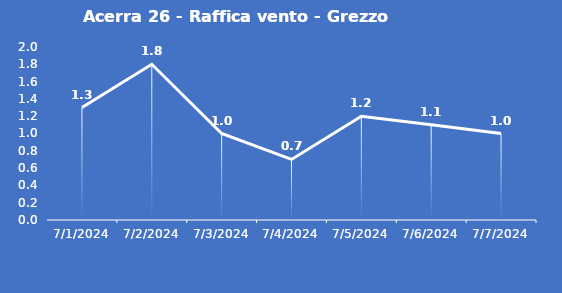
| Category | Acerra 26 - Raffica vento - Grezzo (m/s) |
|---|---|
| 7/1/24 | 1.3 |
| 7/2/24 | 1.8 |
| 7/3/24 | 1 |
| 7/4/24 | 0.7 |
| 7/5/24 | 1.2 |
| 7/6/24 | 1.1 |
| 7/7/24 | 1 |